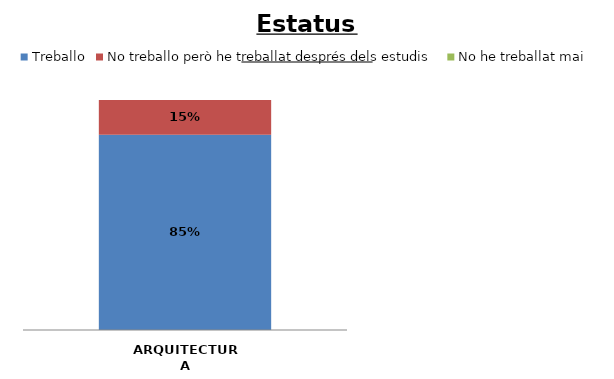
| Category | Treballo | No treballo però he treballat després dels estudis | No he treballat mai |
|---|---|---|---|
| ARQUITECTURA | 0.848 | 0.152 | 0 |